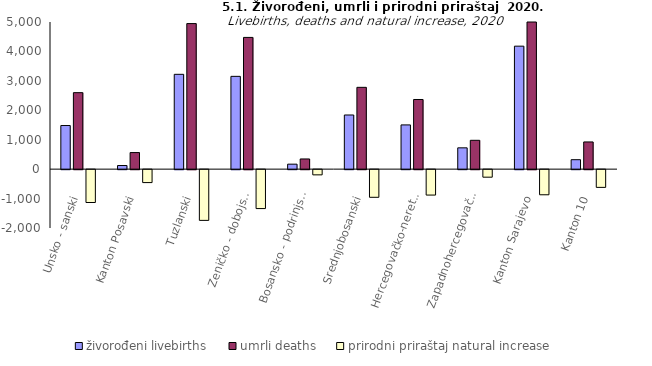
| Category | živorođeni livebirths | umrli deaths | prirodni priraštaj natural increase |
|---|---|---|---|
| Unsko - sanski | 1482 | 2599 | -1117 |
| Kanton Posavski | 123 | 563 | -440 |
| Tuzlanski | 3222 | 4946 | -1724 |
| Zeničko - dobojski | 3153 | 4476 | -1323 |
| Bosansko - podrinjski | 169 | 346 | -177 |
| Srednjobosanski | 1840 | 2780 | -940 |
| Hercegovačko-neretvanski | 1503 | 2367 | -864 |
| Zapadnohercegovački | 724 | 980 | -256 |
| Kanton Sarajevo | 4179 | 5033 | -854 |
| Kanton 10 | 321 | 924 | -603 |